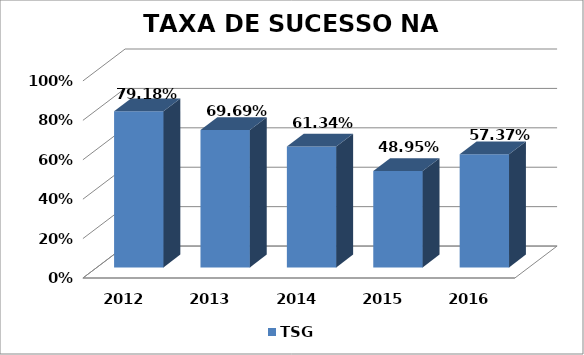
| Category | TSG |
|---|---|
| 2012.0 | 0.792 |
| 2013.0 | 0.697 |
| 2014.0 | 0.613 |
| 2015.0 | 0.489 |
| 2016.0 | 0.574 |